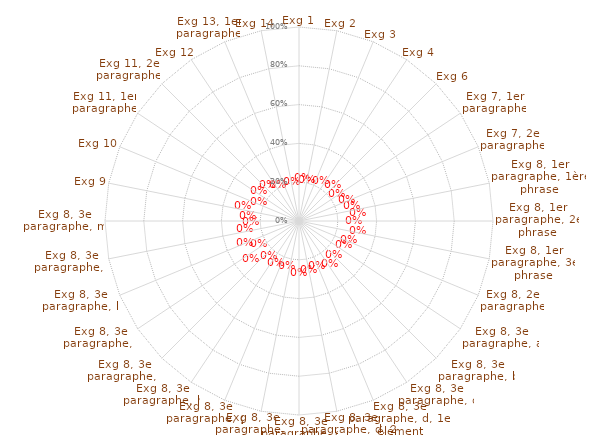
| Category | Article 10 |
|---|---|
| Exg 1 | 0 |
| Exg 2 | 0 |
| Exg 3 | 0 |
| Exg 4 | 0 |
| Exg 6 | 0 |
| Exg 7, 1er paragraphe | 0 |
| Exg 7, 2e paragraphe | 0 |
| Exg 8, 1er paragraphe, 1ère phrase | 0 |
| Exg 8, 1er paragraphe, 2e phrase | 0 |
| Exg 8, 1er paragraphe, 3e phrase | 0 |
| Exg 8, 2e paragraphe | 0 |
| Exg 8, 3e paragraphe, a | 0 |
| Exg 8, 3e paragraphe, b | 0 |
| Exg 8, 3e paragraphe, c | 0 |
| Exg 8, 3e paragraphe, d, 1er élément | 0 |
| Exg 8, 3e paragraphe, d, 2e élément | 0 |
| Exg 8, 3e paragraphe, e | 0 |
| Exg 8, 3e paragraphe, f | 0 |
| Exg 8, 3e paragraphe, g | 0 |
| Exg 8, 3e paragraphe, h | 0 |
| Exg 8, 3e paragraphe, i | 0 |
| Exg 8, 3e paragraphe, j | 0 |
| Exg 8, 3e paragraphe, k | 0 |
| Exg 8, 3e paragraphe, l | 0 |
| Exg 8, 3e paragraphe, m | 0 |
| Exg 9 | 0 |
| Exg 10 | 0 |
| Exg 11, 1er paragraphe | 0 |
| Exg 11, 2e paragraphe | 0 |
| Exg 12 | 0 |
| Exg 13, 1er paragraphe | 0 |
| Exg 14 | 0 |